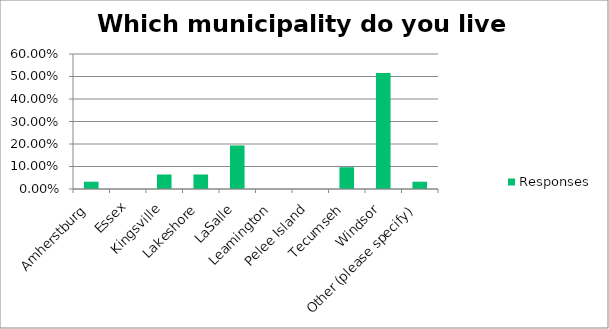
| Category | Responses |
|---|---|
| Amherstburg | 0.032 |
| Essex | 0 |
| Kingsville | 0.064 |
| Lakeshore | 0.064 |
| LaSalle | 0.194 |
| Leamington | 0 |
| Pelee Island | 0 |
| Tecumseh | 0.097 |
| Windsor | 0.516 |
| Other (please specify) | 0.032 |